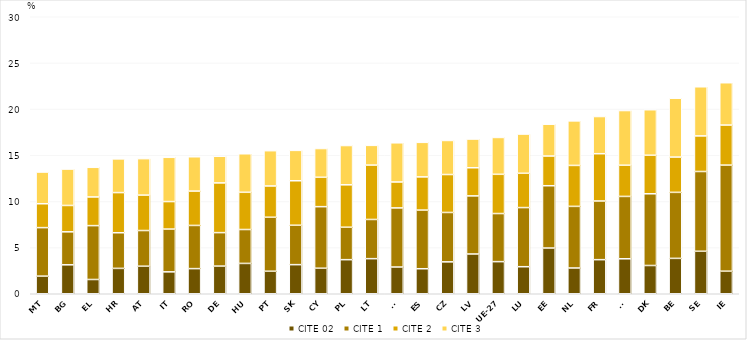
| Category | CITE 02 | CITE 1 | CITE 2 | CITE 3 |
|---|---|---|---|---|
| MT | 1.908 | 5.254 | 2.586 | 3.433 |
| BG | 3.134 | 3.573 | 2.856 | 3.942 |
| EL | 1.543 | 5.836 | 3.105 | 3.209 |
| HR | 2.748 | 3.86 | 4.349 | 3.651 |
| AT | 2.983 | 3.864 | 3.837 | 3.95 |
| IT | 2.373 | 4.632 | 2.98 | 4.793 |
| RO | 2.722 | 4.677 | 3.718 | 3.72 |
| DE | 2.996 | 3.625 | 5.385 | 2.884 |
| HU | 3.285 | 3.672 | 4.031 | 4.174 |
| PT | 2.439 | 5.847 | 3.389 | 3.82 |
| SK | 3.151 | 4.269 | 4.818 | 3.29 |
| CY | 2.765 | 6.666 | 3.183 | 3.114 |
| PL | 3.691 | 3.514 | 4.595 | 4.254 |
| LT | 3.8 | 4.245 | 5.89 | 2.136 |
| SI | 2.894 | 6.403 | 2.806 | 4.247 |
| ES | 2.708 | 6.353 | 3.596 | 3.74 |
| CZ | 3.455 | 5.348 | 4.11 | 3.688 |
| LV | 4.307 | 6.293 | 3.047 | 3.109 |
| UE-27 | 3.478 | 5.21 | 4.249 | 3.992 |
| LU | 2.928 | 6.404 | 3.715 | 4.248 |
| EE | 4.95 | 6.75 | 3.217 | 3.445 |
| NL | 2.789 | 6.675 | 4.435 | 4.824 |
| FR | 3.691 | 6.357 | 5.119 | 4.027 |
| FI | 3.787 | 6.754 | 3.378 | 5.922 |
| DK | 3.061 | 7.767 | 4.175 | 4.927 |
| BE | 3.832 | 7.149 | 3.822 | 6.373 |
| SE | 4.601 | 8.639 | 3.855 | 5.32 |
| IE | 2.444 | 11.489 | 4.336 | 4.584 |